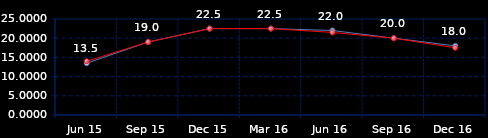
| Category | Series 0 | Series 1 |
|---|---|---|
| Jun 15 | 13.5 | 14 |
| Sep 15 | 19 | 19 |
| Dec 15 | 22.5 | 22.5 |
| Mar 16 | 22.5 | 22.5 |
| Jun 16 | 22 | 21.5 |
| Sep 16 | 20 | 20 |
| Dec 16 | 18 | 17.5 |